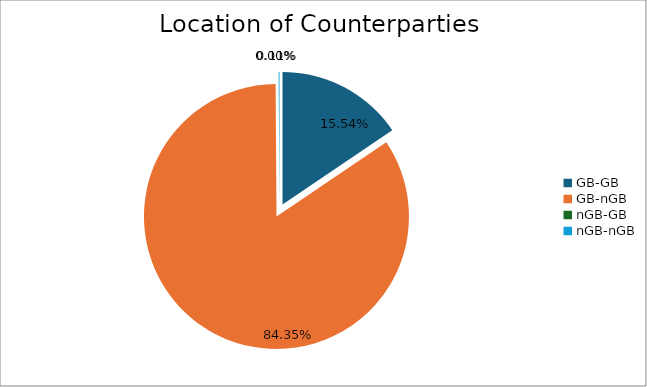
| Category | Series 0 |
|---|---|
| GB-GB | 1840544.247 |
| GB-nGB | 9991056.971 |
| nGB-GB | 0 |
| nGB-nGB | 12685.951 |